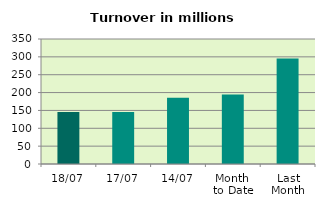
| Category | Series 0 |
|---|---|
| 18/07 | 145.871 |
| 17/07 | 145.807 |
| 14/07 | 185.151 |
| Month 
to Date | 194.333 |
| Last
Month | 295.453 |